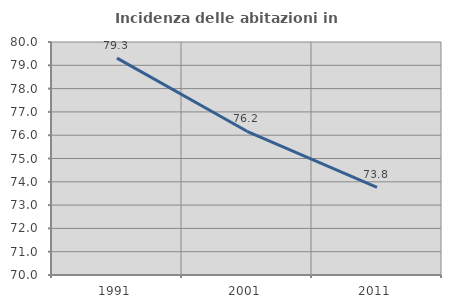
| Category | Incidenza delle abitazioni in proprietà  |
|---|---|
| 1991.0 | 79.31 |
| 2001.0 | 76.168 |
| 2011.0 | 73.756 |